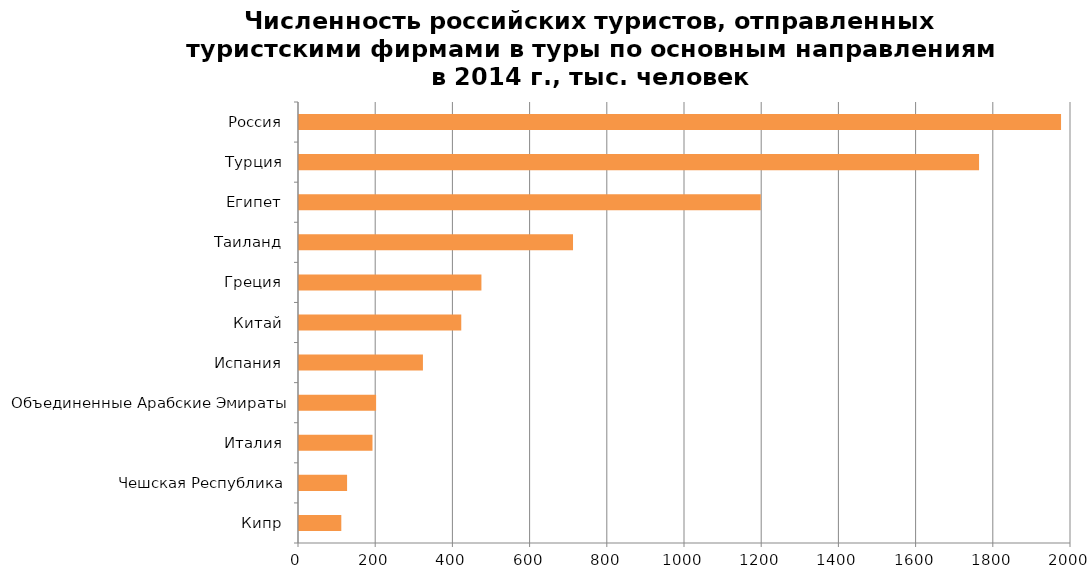
| Category | Series 0 |
|---|---|
| Кипр | 109.597 |
| Чешская Республика | 124.562 |
| Италия | 190.387 |
| Объединенные Арабские Эмираты | 199.758 |
| Испания | 321.074 |
| Китай | 420.367 |
| Греция | 472.59 |
| Таиланд | 709.877 |
| Египет | 1196.341 |
| Турция | 1761.814 |
| Россия | 1974.211 |